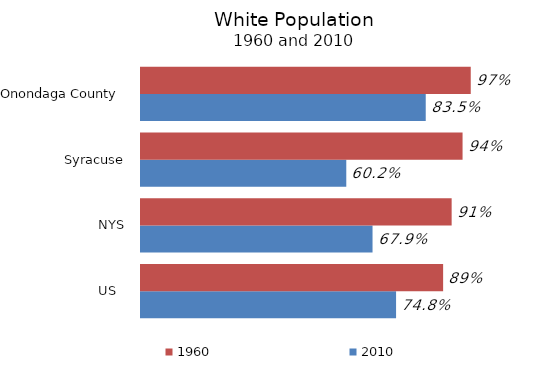
| Category | 2010 | 1960 |
|---|---|---|
| US   | 0.748 | 0.886 |
| NYS | 0.679 | 0.911 |
| Syracuse | 0.602 | 0.943 |
| Onondaga County  | 0.835 | 0.967 |